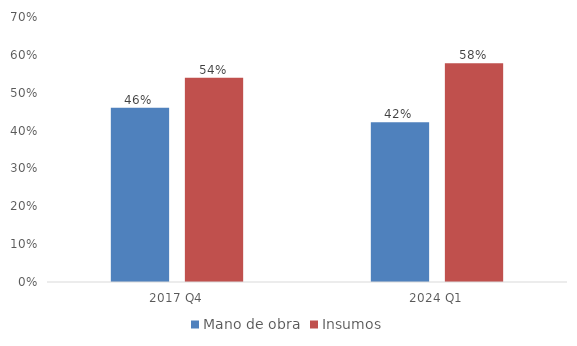
| Category | Mano de obra | Insumos |
|---|---|---|
| 2017 Q4 | 0.46 | 0.54 |
| 2024 Q1 | 0.422 | 0.578 |